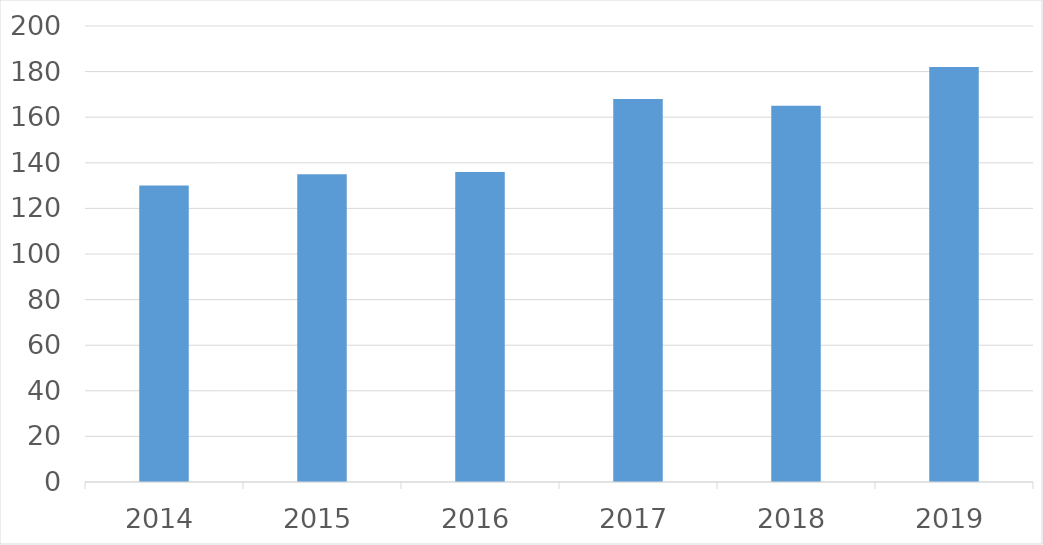
| Category | Series 0 |
|---|---|
| 2014 | 130 |
| 2015 | 135 |
| 2016 | 136 |
| 2017 | 168 |
| 2018 | 165 |
| 2019 | 182 |